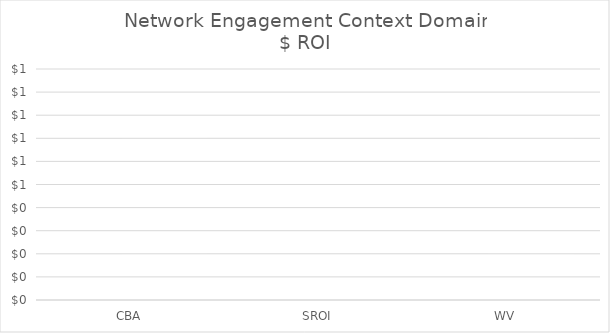
| Category | Network engagement |
|---|---|
| CBA | 0 |
| SROI | 0 |
| WV | 0 |